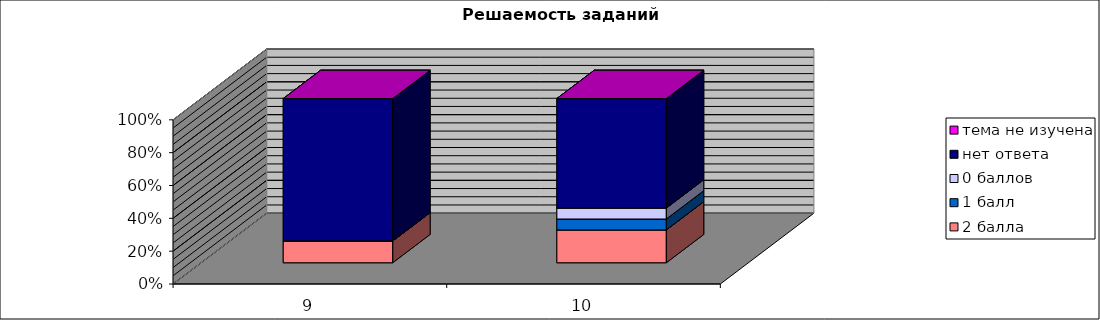
| Category | 4 балла | 3 балла | 2 балла | 1 балл | 0 баллов | нет ответа | тема не изучена |
|---|---|---|---|---|---|---|---|
| 9.0 |  |  | 0.133 | 0 | 0 | 0.867 | 0 |
| 10.0 |  |  | 0.2 | 0.067 | 0.067 | 0.667 | 0 |